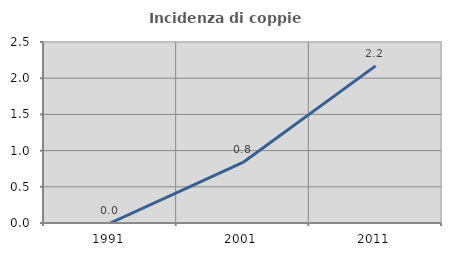
| Category | Incidenza di coppie miste |
|---|---|
| 1991.0 | 0 |
| 2001.0 | 0.836 |
| 2011.0 | 2.17 |